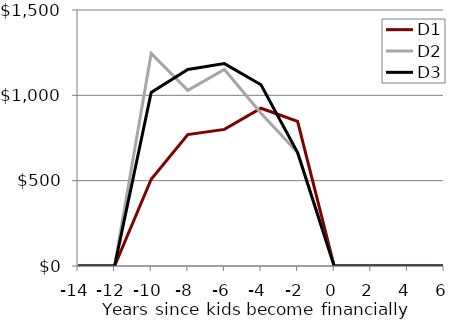
| Category | D1 | D2 | D3 |
|---|---|---|---|
| -14.0 | 0 | 0 | 0 |
| -12.0 | 0 | 0 | 0 |
| -10.0 | 508.228 | 1245.62 | 1016.456 |
| -8.0 | 770.229 | 1029.002 | 1151.571 |
| -6.0 | 800.469 | 1151.571 | 1185.865 |
| -4.0 | 924.275 | 894.785 | 1061.766 |
| -2.0 | 847.047 | 664.716 | 664.716 |
| 0.0 | 0 | 0 | 0 |
| 2.0 | 0 | 0 | 0 |
| 4.0 | 0 | 0 | 0 |
| 6.0 | 0 | 0 | 0 |